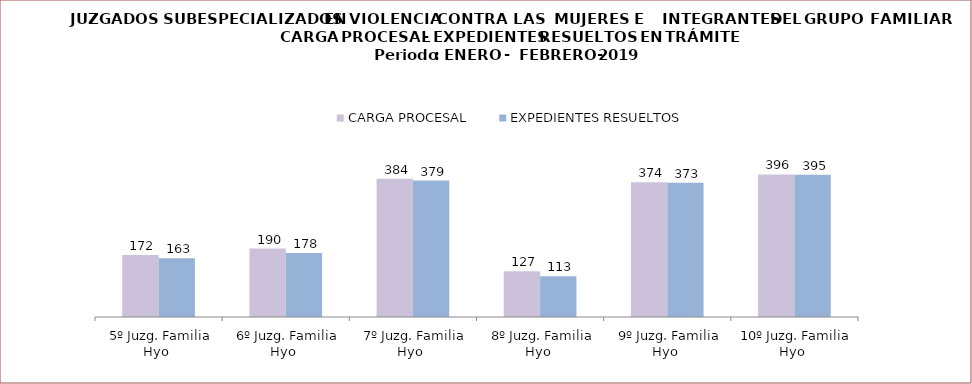
| Category | CARGA PROCESAL | EXPEDIENTES RESUELTOS |
|---|---|---|
| 5º Juzg. Familia Hyo | 172 | 163 |
| 6º Juzg. Familia Hyo | 190 | 178 |
| 7º Juzg. Familia Hyo | 384 | 379 |
| 8º Juzg. Familia Hyo | 127 | 113 |
| 9º Juzg. Familia Hyo | 374 | 373 |
| 10º Juzg. Familia Hyo | 396 | 395 |